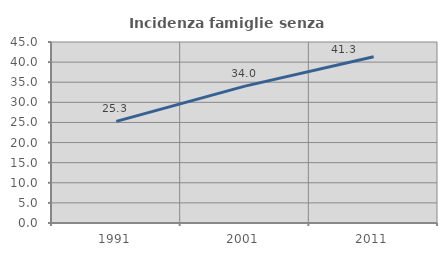
| Category | Incidenza famiglie senza nuclei |
|---|---|
| 1991.0 | 25.258 |
| 2001.0 | 34.034 |
| 2011.0 | 41.313 |